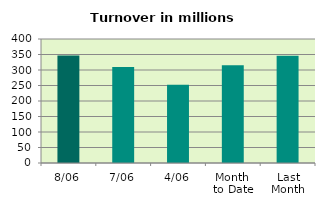
| Category | Series 0 |
|---|---|
| 8/06 | 346.962 |
| 7/06 | 309.545 |
| 4/06 | 252.646 |
| Month 
to Date | 315.307 |
| Last
Month | 346.329 |